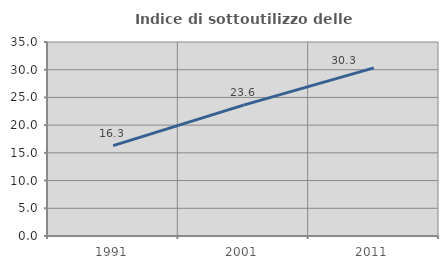
| Category | Indice di sottoutilizzo delle abitazioni  |
|---|---|
| 1991.0 | 16.307 |
| 2001.0 | 23.618 |
| 2011.0 | 30.33 |